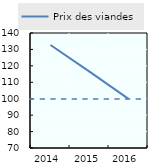
| Category | Prix des viandes |
|---|---|
| 2014.0 | 132.692 |
| 2015.0 | 116.455 |
| 2016.0 | 99.934 |